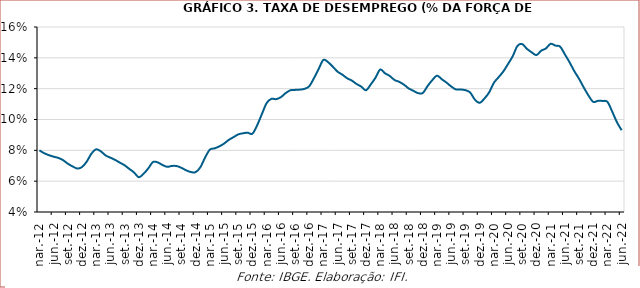
| Category | Taxa de desemprego |
|---|---|
| 2012-03-01 | 0.08 |
| 2012-04-01 | 0.078 |
| 2012-05-01 | 0.077 |
| 2012-06-01 | 0.076 |
| 2012-07-01 | 0.075 |
| 2012-08-01 | 0.074 |
| 2012-09-01 | 0.071 |
| 2012-10-01 | 0.07 |
| 2012-11-01 | 0.068 |
| 2012-12-01 | 0.069 |
| 2013-01-01 | 0.073 |
| 2013-02-01 | 0.078 |
| 2013-03-01 | 0.081 |
| 2013-04-01 | 0.079 |
| 2013-05-01 | 0.077 |
| 2013-06-01 | 0.075 |
| 2013-07-01 | 0.074 |
| 2013-08-01 | 0.072 |
| 2013-09-01 | 0.07 |
| 2013-10-01 | 0.068 |
| 2013-11-01 | 0.066 |
| 2013-12-01 | 0.063 |
| 2014-01-01 | 0.065 |
| 2014-02-01 | 0.068 |
| 2014-03-01 | 0.072 |
| 2014-04-01 | 0.072 |
| 2014-05-01 | 0.071 |
| 2014-06-01 | 0.069 |
| 2014-07-01 | 0.07 |
| 2014-08-01 | 0.07 |
| 2014-09-01 | 0.069 |
| 2014-10-01 | 0.067 |
| 2014-11-01 | 0.066 |
| 2014-12-01 | 0.066 |
| 2015-01-01 | 0.069 |
| 2015-02-01 | 0.075 |
| 2015-03-01 | 0.08 |
| 2015-04-01 | 0.081 |
| 2015-05-01 | 0.083 |
| 2015-06-01 | 0.084 |
| 2015-07-01 | 0.087 |
| 2015-08-01 | 0.089 |
| 2015-09-01 | 0.09 |
| 2015-10-01 | 0.091 |
| 2015-11-01 | 0.091 |
| 2015-12-01 | 0.091 |
| 2016-01-01 | 0.096 |
| 2016-02-01 | 0.103 |
| 2016-03-01 | 0.111 |
| 2016-04-01 | 0.113 |
| 2016-05-01 | 0.113 |
| 2016-06-01 | 0.114 |
| 2016-07-01 | 0.117 |
| 2016-08-01 | 0.119 |
| 2016-09-01 | 0.119 |
| 2016-10-01 | 0.119 |
| 2016-11-01 | 0.12 |
| 2016-12-01 | 0.122 |
| 2017-01-01 | 0.127 |
| 2017-02-01 | 0.133 |
| 2017-03-01 | 0.139 |
| 2017-04-01 | 0.137 |
| 2017-05-01 | 0.134 |
| 2017-06-01 | 0.131 |
| 2017-07-01 | 0.129 |
| 2017-08-01 | 0.127 |
| 2017-09-01 | 0.125 |
| 2017-10-01 | 0.123 |
| 2017-11-01 | 0.121 |
| 2017-12-01 | 0.119 |
| 2018-01-01 | 0.123 |
| 2018-02-01 | 0.127 |
| 2018-03-01 | 0.132 |
| 2018-04-01 | 0.13 |
| 2018-05-01 | 0.128 |
| 2018-06-01 | 0.126 |
| 2018-07-01 | 0.124 |
| 2018-08-01 | 0.123 |
| 2018-09-01 | 0.12 |
| 2018-10-01 | 0.119 |
| 2018-11-01 | 0.117 |
| 2018-12-01 | 0.117 |
| 2019-01-01 | 0.122 |
| 2019-02-01 | 0.126 |
| 2019-03-01 | 0.128 |
| 2019-04-01 | 0.126 |
| 2019-05-01 | 0.124 |
| 2019-06-01 | 0.121 |
| 2019-07-01 | 0.12 |
| 2019-08-01 | 0.119 |
| 2019-09-01 | 0.119 |
| 2019-10-01 | 0.118 |
| 2019-11-01 | 0.113 |
| 2019-12-01 | 0.111 |
| 2020-01-01 | 0.114 |
| 2020-02-01 | 0.118 |
| 2020-03-01 | 0.124 |
| 2020-04-01 | 0.127 |
| 2020-05-01 | 0.131 |
| 2020-06-01 | 0.136 |
| 2020-07-01 | 0.141 |
| 2020-08-01 | 0.148 |
| 2020-09-01 | 0.149 |
| 2020-10-01 | 0.146 |
| 2020-11-01 | 0.144 |
| 2020-12-01 | 0.142 |
| 2021-01-01 | 0.145 |
| 2021-02-01 | 0.146 |
| 2021-03-01 | 0.149 |
| 2021-04-01 | 0.148 |
| 2021-05-01 | 0.147 |
| 2021-06-01 | 0.142 |
| 2021-07-01 | 0.137 |
| 2021-08-01 | 0.131 |
| 2021-09-01 | 0.126 |
| 2021-10-01 | 0.121 |
| 2021-11-01 | 0.116 |
| 2021-12-01 | 0.111 |
| 2022-01-01 | 0.112 |
| 2022-02-01 | 0.112 |
| 2022-03-01 | 0.111 |
| 2022-04-01 | 0.105 |
| 2022-05-01 | 0.098 |
| 2022-06-01 | 0.093 |